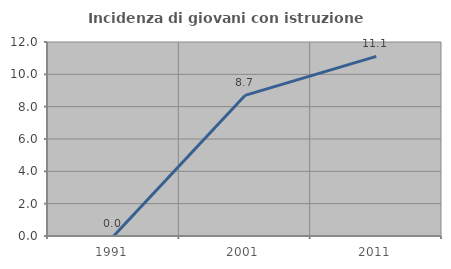
| Category | Incidenza di giovani con istruzione universitaria |
|---|---|
| 1991.0 | 0 |
| 2001.0 | 8.696 |
| 2011.0 | 11.111 |